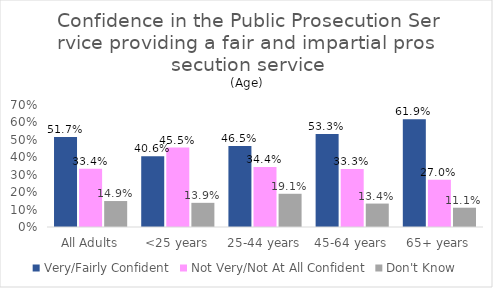
| Category | Very/Fairly Confident | Not Very/Not At All Confident | Don't Know |
|---|---|---|---|
| All Adults | 0.517 | 0.334 | 0.149 |
| <25 years | 0.406 | 0.455 | 0.139 |
| 25-44 years | 0.465 | 0.344 | 0.191 |
| 45-64 years | 0.533 | 0.333 | 0.134 |
| 65+ years | 0.619 | 0.27 | 0.111 |